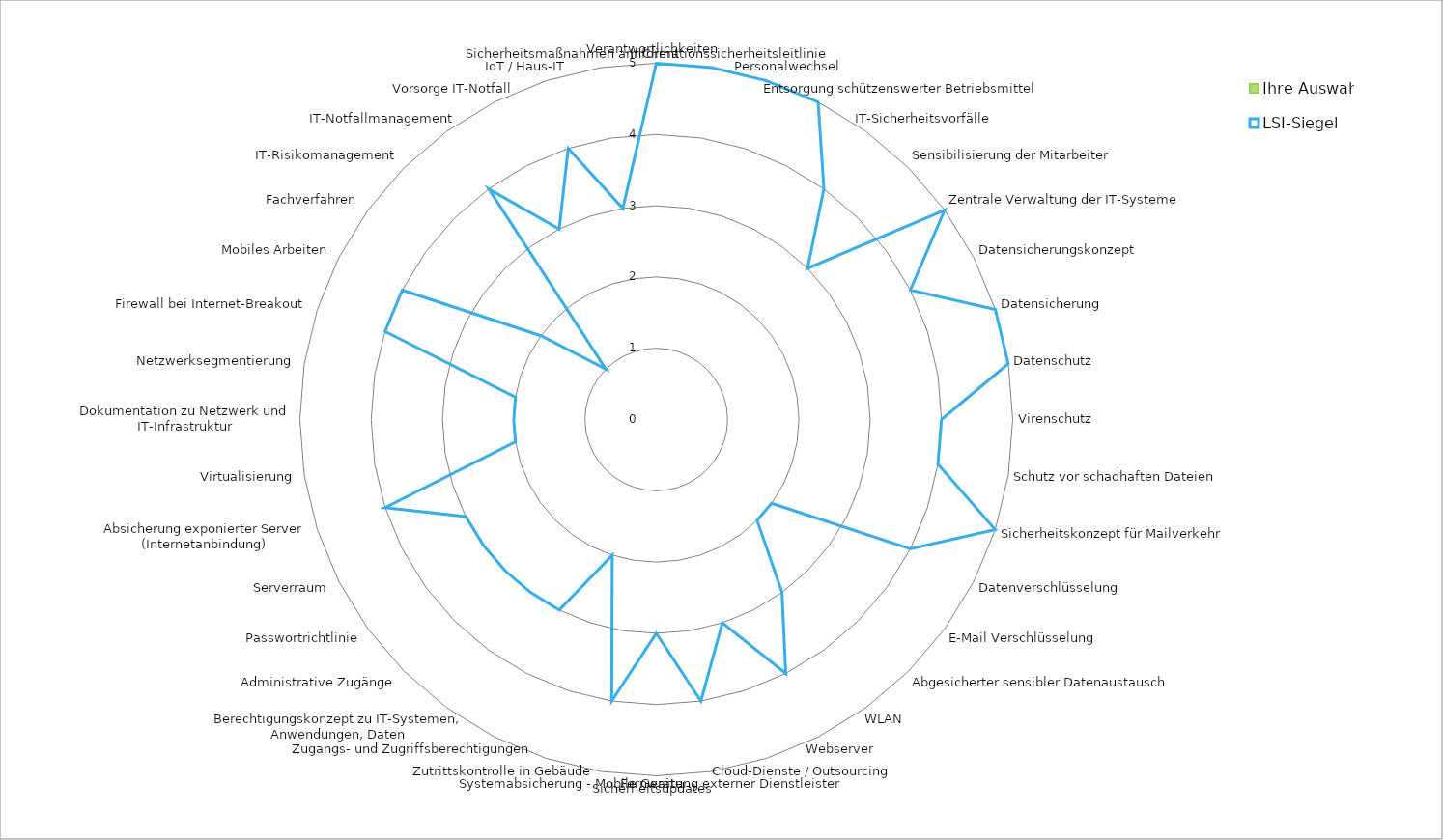
| Category | Ihre Auswahl | LSI-Siegel |
|---|---|---|
| Verantwortlichkeiten | 0 | 5 |
| Informationssicherheitsleitlinie  | 0 | 5 |
| Personalwechsel | 0 | 5 |
| Entsorgung schützenswerter Betriebsmittel | 0 | 5 |
| IT-Sicherheitsvorfälle | 0 | 4 |
| Sensibilisierung der Mitarbeiter | 0 | 3 |
| Zentrale Verwaltung der IT-Systeme | 0 | 5 |
| Datensicherungskonzept | 0 | 4 |
| Datensicherung | 0 | 5 |
| Datenschutz | 0 | 5 |
| Virenschutz | 0 | 4 |
| Schutz vor schadhaften Dateien | 0 | 4 |
| Sicherheitskonzept für Mailverkehr | 0 | 5 |
| Datenverschlüsselung | 0 | 4 |
| E-Mail Verschlüsselung | 0 | 2 |
| Abgesicherter sensibler Datenaustausch | 0 | 2 |
| WLAN | 0 | 3 |
| Webserver | 0 | 4 |
| Cloud-Dienste / Outsourcing | 0 | 3 |
| Fernwartung externer Dienstleister | 0 | 4 |
| Sicherheitsupdates | 0 | 3 |
| Systemabsicherung - Mobile Geräte | 0 | 4 |
| Zutrittskontrolle in Gebäude | 0 | 2 |
| Zugangs- und Zugriffsberechtigungen | 0 | 3 |
| Berechtigungskonzept zu IT-Systemen, Anwendungen, Daten | 0 | 3 |
| Administrative Zugänge | 0 | 3 |
| Passwortrichtlinie | 0 | 3 |
| Serverraum | 0 | 3 |
| Absicherung exponierter Server (Internetanbindung) | 0 | 4 |
| Virtualisierung | 0 | 2 |
| Dokumentation zu Netzwerk und IT-Infrastruktur | 0 | 2 |
| Netzwerksegmentierung | 0 | 2 |
| Firewall bei Internet-Breakout | 0 | 4 |
| Mobiles Arbeiten | 0 | 4 |
| Fachverfahren | 0 | 2 |
| IT-Risikomanagement | 0 | 1 |
| IT-Notfallmanagement | 0 | 4 |
| Vorsorge IT-Notfall | 0 | 3 |
| IoT / Haus-IT | 0 | 4 |
| Sicherheitsmaßnahmen am Client | 0 | 3 |